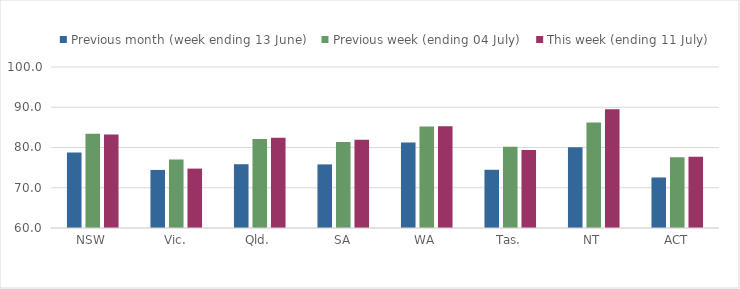
| Category | Previous month (week ending 13 June) | Previous week (ending 04 July) | This week (ending 11 July) |
|---|---|---|---|
| NSW | 78.735 | 83.42 | 83.199 |
| Vic. | 74.423 | 77.006 | 74.76 |
| Qld. | 75.845 | 82.136 | 82.417 |
| SA | 75.801 | 81.385 | 81.94 |
| WA | 81.216 | 85.218 | 85.293 |
| Tas. | 74.467 | 80.201 | 79.375 |
| NT | 80.05 | 86.187 | 89.482 |
| ACT | 72.556 | 77.608 | 77.682 |